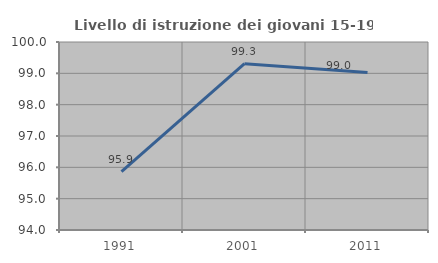
| Category | Livello di istruzione dei giovani 15-19 anni |
|---|---|
| 1991.0 | 95.866 |
| 2001.0 | 99.31 |
| 2011.0 | 99.023 |